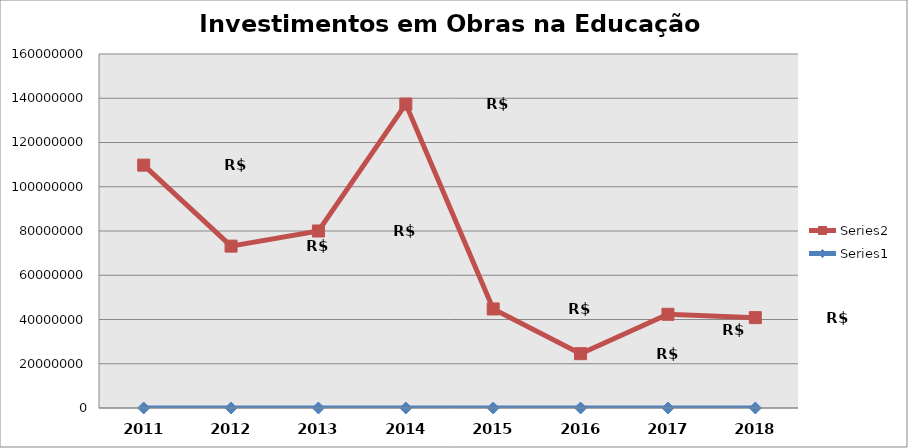
| Category | Series 0 | Series 1 |
|---|---|---|
| 2011.0 | 2011 | 109769224.61 |
| 2012.0 | 2012 | 73156238.58 |
| 2013.0 | 2013 | 80000029.41 |
| 2014.0 | 2014 | 137379485.46 |
| 2015.0 | 2015 | 44761944.98 |
| 2016.0 | 2016 | 24558770.43 |
| 2017.0 | 2017 | 42363411.29 |
| 2018.0 | 2018 | 40840849.8 |